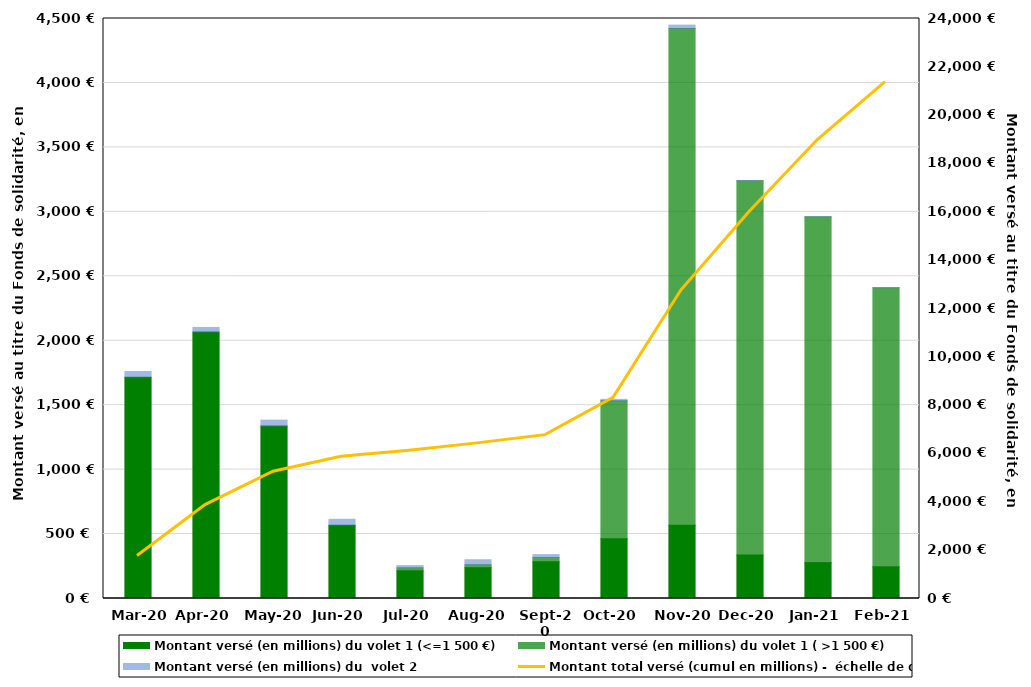
| Category | Montant versé (en millions) du volet 1 (<=1 500 €) | Montant versé (en millions) du volet 1 ( >1 500 €) | Montant versé (en millions) du  volet 2 |
|---|---|---|---|
| 2020-03-01 | 1717.2 | 0 | 43.7 |
| 2020-04-01 | 2067.6 | 0 | 35.7 |
| 2020-05-01 | 1338.5 | 0 | 45.6 |
| 2020-06-01 | 568.7 | 0 | 46 |
| 2020-07-01 | 215.1 | 23.1 | 16.8 |
| 2020-08-01 | 238.8 | 23.3 | 38.6 |
| 2020-09-01 | 284.2 | 33.4 | 22.8 |
| 2020-10-01 | 464.5 | 1069 | 11.7 |
| 2020-11-01 | 567.9 | 3854.3 | 26.4 |
| 2020-12-01 | 336.6 | 2905 | 2 |
| 2021-01-01 | 278.3 | 2683.2 | 0.5 |
| 2021-02-01 | 246.1 | 2164.1 | 1.3 |